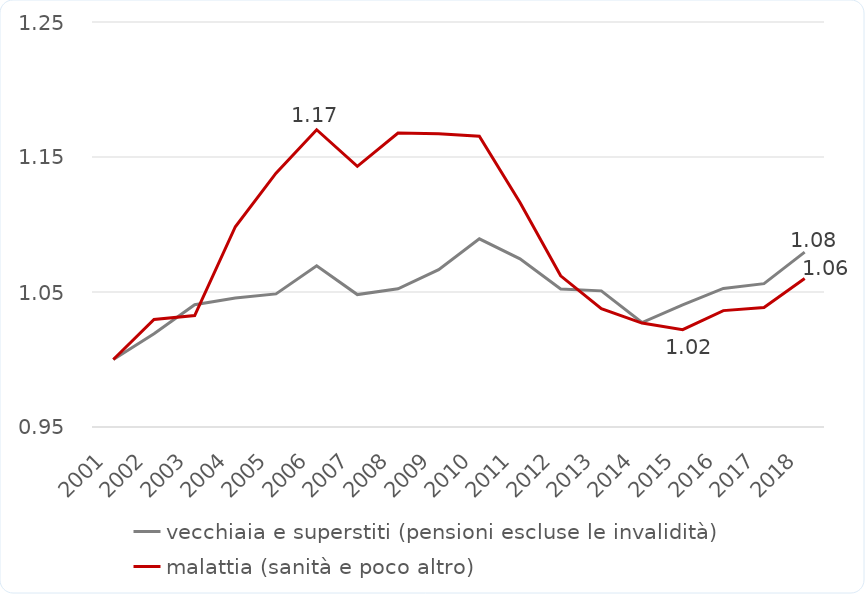
| Category | vecchiaia e superstiti (pensioni escluse le invalidità) | malattia (sanità e poco altro) |
|---|---|---|
| 2001 | 1 | 1 |
| 2002 | 1.019 | 1.03 |
| 2003 | 1.041 | 1.033 |
| 2004 | 1.046 | 1.098 |
| 2005 | 1.049 | 1.138 |
| 2006 | 1.069 | 1.17 |
| 2007 | 1.048 | 1.143 |
| 2008 | 1.052 | 1.168 |
| 2009 | 1.066 | 1.167 |
| 2010 | 1.089 | 1.165 |
| 2011 | 1.075 | 1.116 |
| 2012 | 1.052 | 1.062 |
| 2013 | 1.051 | 1.038 |
| 2014 | 1.027 | 1.027 |
| 2015 | 1.04 | 1.022 |
| 2016 | 1.053 | 1.036 |
| 2017 | 1.056 | 1.039 |
| 2018 | 1.08 | 1.06 |